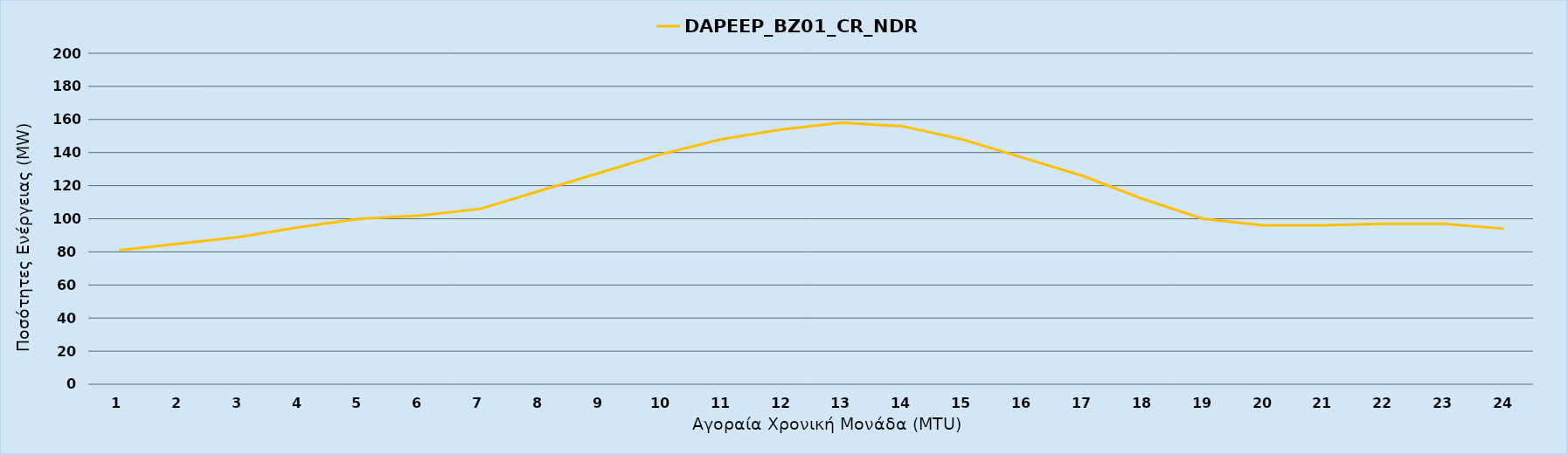
| Category | DAPEEP_BZ01_CR_NDR |
|---|---|
| 0 | 81 |
| 1 | 85 |
| 2 | 89 |
| 3 | 95 |
| 4 | 100 |
| 5 | 102 |
| 6 | 106 |
| 7 | 117 |
| 8 | 128 |
| 9 | 139 |
| 10 | 148 |
| 11 | 154 |
| 12 | 158 |
| 13 | 156 |
| 14 | 148 |
| 15 | 137 |
| 16 | 126 |
| 17 | 112 |
| 18 | 100 |
| 19 | 96 |
| 20 | 96 |
| 21 | 97 |
| 22 | 97 |
| 23 | 94 |